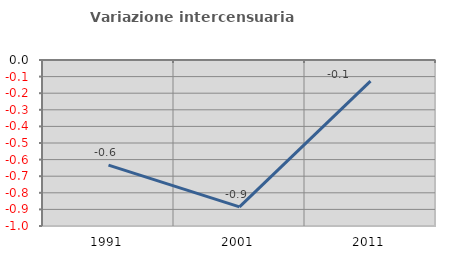
| Category | Variazione intercensuaria annua |
|---|---|
| 1991.0 | -0.633 |
| 2001.0 | -0.885 |
| 2011.0 | -0.128 |